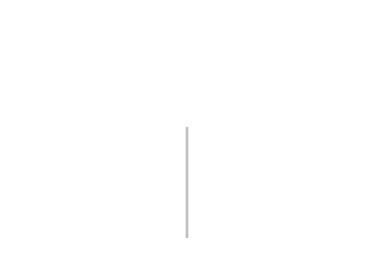
| Category | Positivt | Negativt |
|---|---|---|
| 0 | 0 | 0 |
| 1 | 192 | 0 |
| 2 | 192 | -192 |